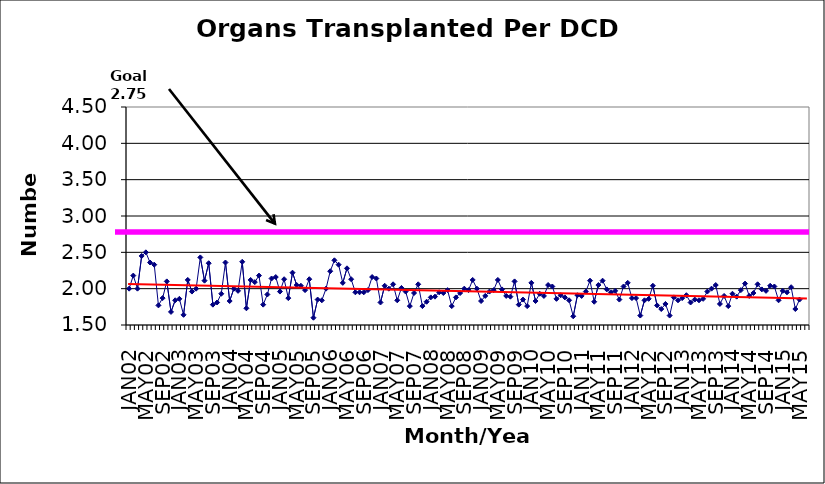
| Category | Series 0 |
|---|---|
| JAN02 | 2 |
| FEB02 | 2.18 |
| MAR02 | 2 |
| APR02 | 2.45 |
| MAY02 | 2.5 |
| JUN02 | 2.36 |
| JUL02 | 2.33 |
| AUG02 | 1.77 |
| SEP02 | 1.87 |
| OCT02 | 2.1 |
| NOV02 | 1.68 |
| DEC02 | 1.84 |
| JAN03 | 1.86 |
| FEB03 | 1.64 |
| MAR03 | 2.12 |
| APR03 | 1.96 |
| MAY03 | 2 |
| JUN03 | 2.43 |
| JUL03 | 2.11 |
| AUG03 | 2.35 |
| SEP03 | 1.78 |
| OCT03 | 1.81 |
| NOV03 | 1.93 |
| DEC03 | 2.36 |
| JAN04 | 1.83 |
| FEB04 | 2 |
| MAR04 | 1.97 |
| APR04 | 2.37 |
| MAY04 | 1.73 |
| JUN04 | 2.12 |
| JUL04 | 2.09 |
| AUG04 | 2.18 |
| SEP04 | 1.78 |
| OCT04 | 1.92 |
| NOV04 | 2.14 |
| DEC04 | 2.16 |
| JAN05 | 1.96 |
| FEB05 | 2.13 |
| MAR05 | 1.87 |
| APR05 | 2.22 |
| MAY05 | 2.05 |
| JUN05 | 2.04 |
| JUL05 | 1.98 |
| AUG05 | 2.13 |
| SEP05 | 1.6 |
| OCT05 | 1.85 |
| NOV05 | 1.84 |
| DEC05 | 2 |
| JAN06 | 2.24 |
| FEB06 | 2.39 |
| MAR06 | 2.33 |
| APR06 | 2.08 |
| MAY06 | 2.28 |
| JUN06 | 2.13 |
| JUL06 | 1.95 |
| AUG06 | 1.95 |
| SEP06 | 1.95 |
| OCT06 | 1.98 |
| NOV06 | 2.16 |
| DEC06 | 2.14 |
| JAN07 | 1.81 |
| FEB07 | 2.04 |
| MAR07 | 2 |
| APR07 | 2.06 |
| MAY07 | 1.84 |
| JUN07 | 2.01 |
| JUL07 | 1.96 |
| AUG07 | 1.76 |
| SEP07 | 1.94 |
| OCT07 | 2.06 |
| NOV07 | 1.76 |
| DEC07 | 1.82 |
| JAN08 | 1.88 |
| FEB08 | 1.89 |
| MAR08 | 1.95 |
| APR08 | 1.94 |
| MAY08 | 1.98 |
| JUN08 | 1.76 |
| JUL08 | 1.88 |
| AUG08 | 1.94 |
| SEP08 | 2 |
| OCT08 | 1.98 |
| NOV08 | 2.12 |
| DEC08 | 2 |
| JAN09 | 1.83 |
| FEB09 | 1.9 |
| MAR09 | 1.96 |
| APR09 | 1.98 |
| MAY09 | 2.12 |
| JUN09 | 1.99 |
| JUL09 | 1.9 |
| AUG09 | 1.89 |
| SEP09 | 2.1 |
| OCT09 | 1.78 |
| NOV09 | 1.85 |
| DEC09 | 1.76 |
| JAN10 | 2.08 |
| FEB10 | 1.83 |
| MAR10 | 1.93 |
| APR10 | 1.9 |
| MAY10 | 2.05 |
| JUN10 | 2.03 |
| JUL10 | 1.86 |
| AUG10 | 1.91 |
| SEP10 | 1.88 |
| OCT10 | 1.84 |
| NOV10 | 1.62 |
| DEC10 | 1.91 |
| JAN11 | 1.9 |
| FEB11 | 1.96 |
| MAR11 | 2.11 |
| APR11 | 1.82 |
| MAY11 | 2.05 |
| JUN11 | 2.11 |
| JUL11 | 1.99 |
| AUG11 | 1.95 |
| SEP11 | 1.97 |
| OCT11 | 1.85 |
| NOV11 | 2.03 |
| DEC11 | 2.08 |
| JAN12 | 1.87 |
| FEB12 | 1.87 |
| MAR12 | 1.63 |
| APR12 | 1.84 |
| MAY12 | 1.86 |
| JUN12 | 2.04 |
| JUL12 | 1.77 |
| AUG12 | 1.72 |
| SEP12 | 1.79 |
| OCT12 | 1.63 |
| NOV12 | 1.88 |
| DEC12 | 1.84 |
| JAN13 | 1.87 |
| FEB13 | 1.91 |
| MAR13 | 1.81 |
| APR13 | 1.85 |
| MAY13 | 1.84 |
| JUN13 | 1.86 |
| JUL13 | 1.96 |
| AUG13 | 2 |
| SEP13 | 2.05 |
| OCT13 | 1.79 |
| NOV13 | 1.9 |
| DEC13 | 1.76 |
| JAN14 | 1.93 |
| FEB14 | 1.89 |
| MAR14 | 1.98 |
| APR14 | 2.07 |
| MAY14 | 1.9 |
| JUN14 | 1.94 |
| JUL14 | 2.06 |
| AUG14 | 1.99 |
| SEP14 | 1.97 |
| OCT14 | 2.04 |
| NOV14 | 2.03 |
| DEC14 | 1.84 |
| JAN15 | 1.97 |
| FEB15 | 1.95 |
| MAR15 | 2.02 |
| APR15 | 1.72 |
| MAY15 | 1.85 |